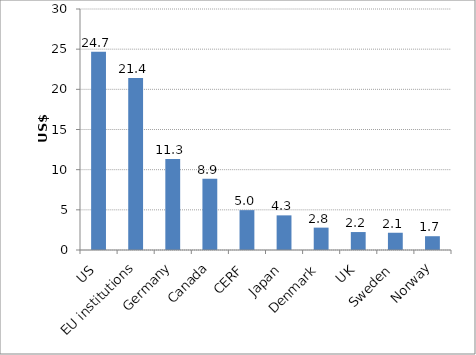
| Category | US$ millions |
|---|---|
| US | 24.666 |
| EU institutions | 21.409 |
| Germany | 11.319 |
| Canada | 8.863 |
| CERF | 4.962 |
| Japan | 4.311 |
| Denmark | 2.785 |
| UK | 2.235 |
| Sweden | 2.147 |
| Norway | 1.716 |